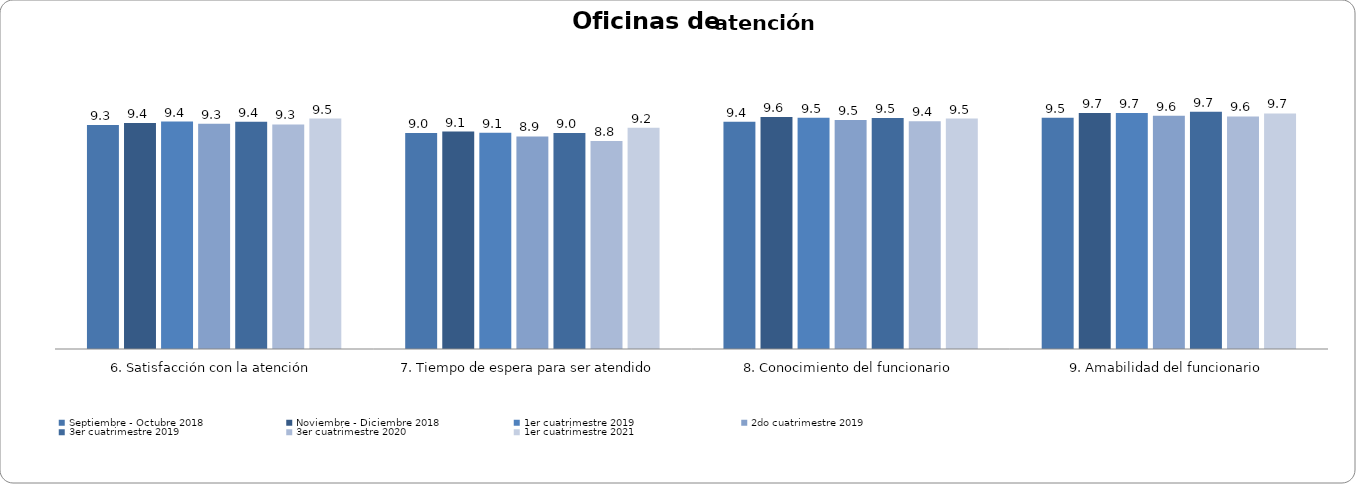
| Category | Septiembre - Octubre 2018 | Noviembre - Diciembre 2018 | 1er cuatrimestre 2019 | 2do cuatrimestre 2019 | 3er cuatrimestre 2019 | 3er cuatrimestre 2020 | 1er cuatrimestre 2021 |
|---|---|---|---|---|---|---|---|
| 6. Satisfacción con la atención | 9.302 | 9.372 | 9.414 | 9.345 | 9.412 | 9.321 | 9.516 |
| 7. Tiempo de espera para ser atendido | 9.043 | 9.091 | 9.051 | 8.93 | 9.04 | 8.781 | 9.211 |
| 8. Conocimiento del funcionario | 9.406 | 9.567 | 9.537 | 9.471 | 9.535 | 9.429 | 9.513 |
| 9. Amabilidad del funcionario | 9.537 | 9.698 | 9.698 | 9.604 | 9.733 | 9.583 | 9.682 |